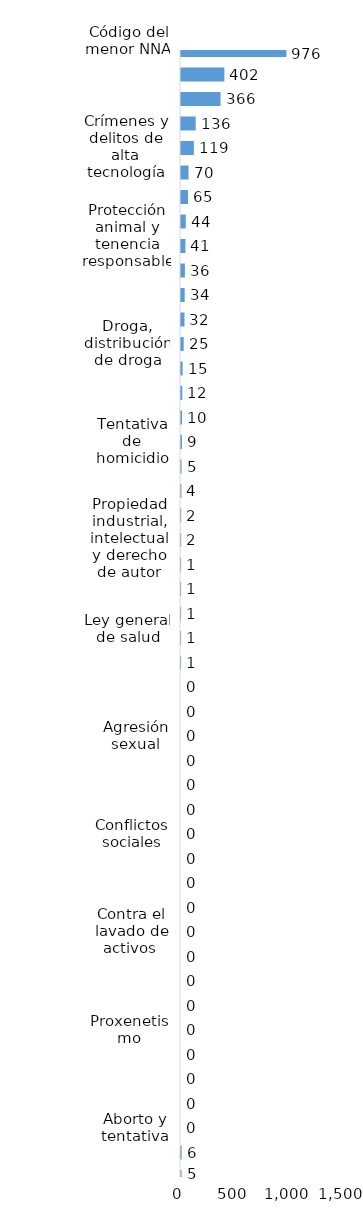
| Category | Series 0 |
|---|---|
| Código del menor NNA | 976 |
| Robo calificado | 402 |
| Golpes y heridas | 366 |
| Amenaza | 136 |
| Crímenes y delitos de alta tecnología | 119 |
| Droga, traficante de droga | 70 |
| Ley de armas | 65 |
| Daños y perjuicios a la cosa ajena | 44 |
| Protección animal y tenencia responsable | 41 |
| Abuso de confianza | 36 |
| Estafa | 34 |
| Homicidio | 32 |
| Droga, distribución de droga | 25 |
| Asociación de malhechores | 15 |
| Droga, sanciones y circunstancias agravantes | 12 |
| Robo simple | 10 |
| Tentativa de homicidio | 9 |
| Código de trabajo | 5 |
| Falsificación | 4 |
| Difamación e injuria | 2 |
| Propiedad industrial, intelectual y derecho de autor | 2 |
| Droga, simple posesión | 1 |
| Pérdida de documento de identidad | 1 |
| Crímenes y delitos contra la propiedad | 1 |
| Ley general de salud | 1 |
| Droga, delitos y sanciones | 1 |
| Violencia intrafamiliar | 0 |
| Violencia de género | 0 |
| Agresión sexual | 0 |
| Violación sexual | 0 |
| Tránsito y seguridad vial  | 0 |
| Desaparición | 0 |
| Conflictos sociales | 0 |
| Tráfico ilícito de migrantes y trata de personas | 0 |
| Medio ambiente y recursos naturales | 0 |
| Secuestro | 0 |
| Contra el lavado de activos  | 0 |
| Juegos de azar | 0 |
| Ley de cheques | 0 |
| Derechos humanos | 0 |
| Proxenetismo | 0 |
| Terrorismo | 0 |
| Soborno | 0 |
| Prevaricación | 0 |
| Aborto y tentativa | 0 |
| Otros | 6 |
| Indeterminados | 5 |